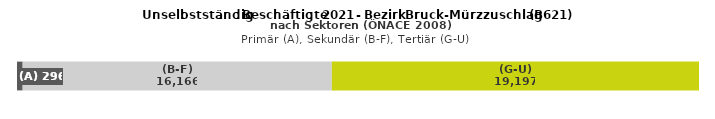
| Category | (A) | (B-F) | (G-U) |
|---|---|---|---|
| 0 | 296 | 16166 | 19197 |